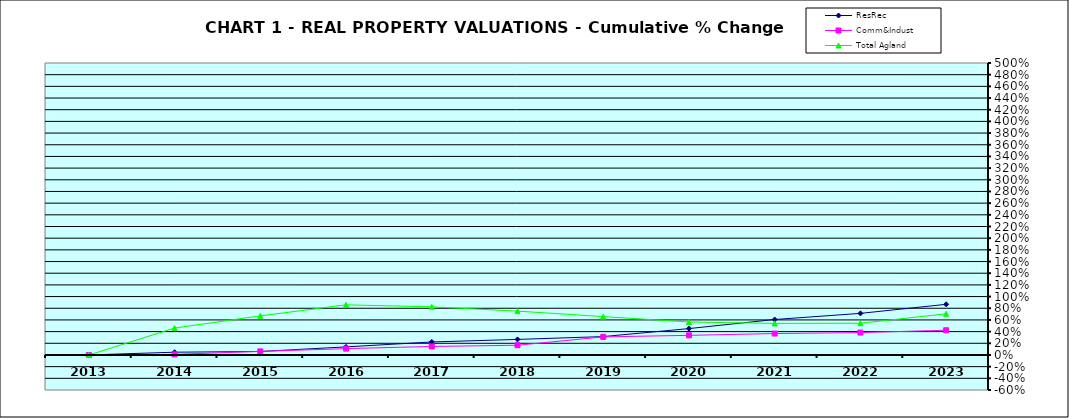
| Category | ResRec | Comm&Indust | Total Agland |
|---|---|---|---|
| 2013.0 | 0 | 0 | 0 |
| 2014.0 | 0.047 | 0.01 | 0.46 |
| 2015.0 | 0.06 | 0.061 | 0.67 |
| 2016.0 | 0.138 | 0.109 | 0.859 |
| 2017.0 | 0.223 | 0.145 | 0.824 |
| 2018.0 | 0.266 | 0.167 | 0.751 |
| 2019.0 | 0.315 | 0.309 | 0.657 |
| 2020.0 | 0.452 | 0.336 | 0.565 |
| 2021.0 | 0.607 | 0.367 | 0.541 |
| 2022.0 | 0.712 | 0.383 | 0.543 |
| 2023.0 | 0.867 | 0.423 | 0.705 |